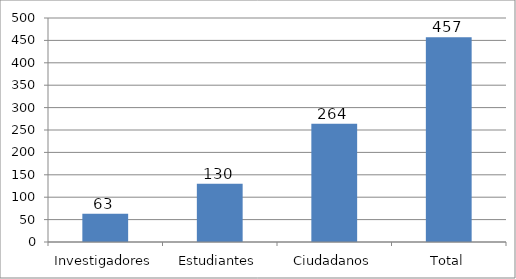
| Category | Series 0 |
|---|---|
| Investigadores | 63 |
| Estudiantes | 130 |
| Ciudadanos | 264 |
| Total | 457 |